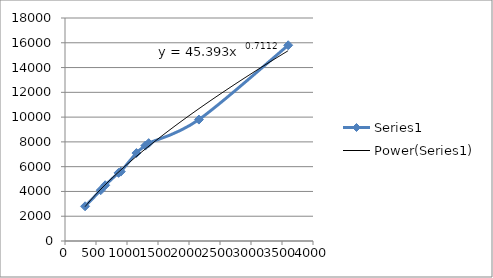
| Category | Series 0 |
|---|---|
| 324.0 | 2800 |
| 576.0 | 4100 |
| 648.0 | 4500 |
| 864.0 | 5500 |
| 900.0 | 5600 |
| 1152.0 | 7100 |
| 1296.0 | 7700 |
| 1350.0 | 7900 |
| 2160.0 | 9800 |
| 3600.0 | 15800 |